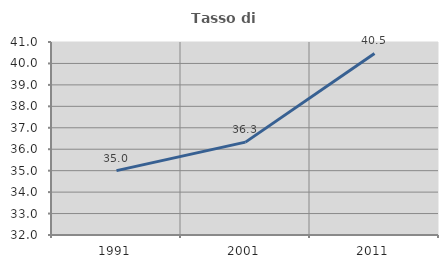
| Category | Tasso di occupazione   |
|---|---|
| 1991.0 | 35.001 |
| 2001.0 | 36.331 |
| 2011.0 | 40.469 |